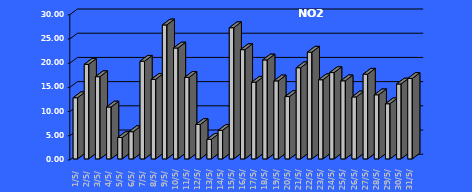
| Category | NO2 [µg/m3] |
|---|---|
| 2023-05-01 | 12.637 |
| 2023-05-02 | 19.538 |
| 2023-05-03 | 16.984 |
| 2023-05-04 | 10.715 |
| 2023-05-05 | 4.413 |
| 2023-05-06 | 5.621 |
| 2023-05-07 | 20.175 |
| 2023-05-08 | 16.426 |
| 2023-05-09 | 27.673 |
| 2023-05-10 | 22.907 |
| 2023-05-11 | 16.841 |
| 2023-05-12 | 7.107 |
| 2023-05-13 | 4.055 |
| 2023-05-14 | 5.902 |
| 2023-05-15 | 27.097 |
| 2023-05-16 | 22.563 |
| 2023-05-17 | 15.845 |
| 2023-05-18 | 20.443 |
| 2023-05-19 | 16.115 |
| 2023-05-20 | 12.875 |
| 2023-05-21 | 18.833 |
| 2023-05-22 | 22.05 |
| 2023-05-23 | 16.349 |
| 2023-05-24 | 17.832 |
| 2023-05-25 | 16.133 |
| 2023-05-26 | 12.805 |
| 2023-05-27 | 17.499 |
| 2023-05-28 | 13.247 |
| 2023-05-29 | 11.392 |
| 2023-05-30 | 15.467 |
| 2023-05-31 | 16.611 |